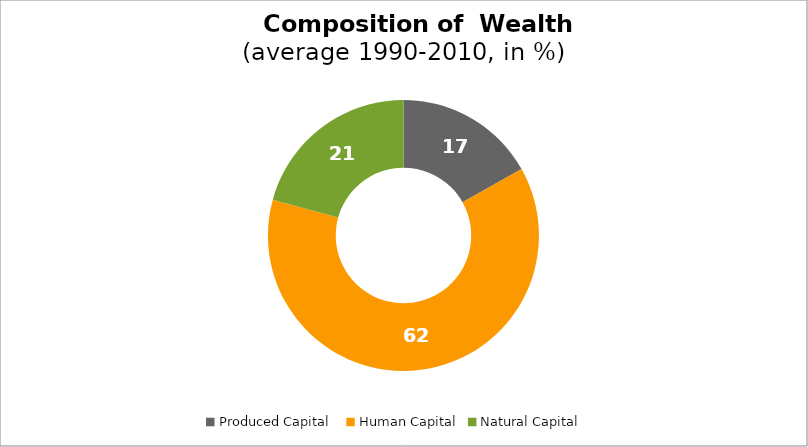
| Category | Series 0 |
|---|---|
| Produced Capital  | 16.833 |
| Human Capital | 62.424 |
| Natural Capital | 20.743 |